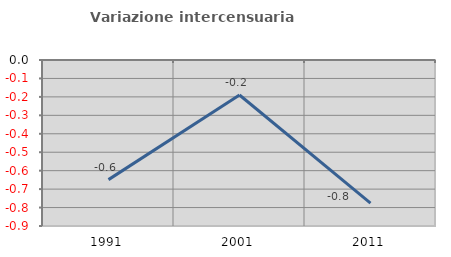
| Category | Variazione intercensuaria annua |
|---|---|
| 1991.0 | -0.649 |
| 2001.0 | -0.19 |
| 2011.0 | -0.776 |